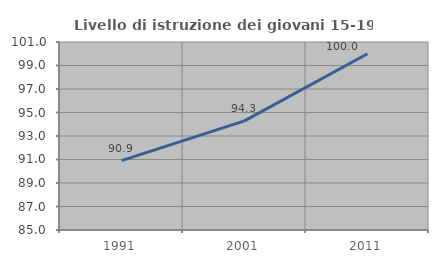
| Category | Livello di istruzione dei giovani 15-19 anni |
|---|---|
| 1991.0 | 90.909 |
| 2001.0 | 94.286 |
| 2011.0 | 100 |